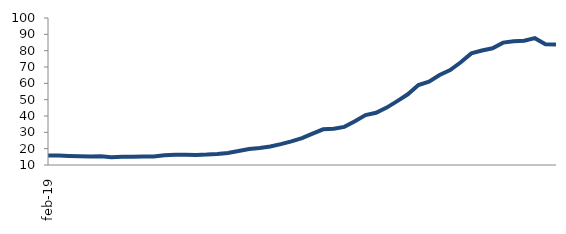
| Category | Series 0 |
|---|---|
| 2019-02-01 | 15.859 |
| 2019-03-01 | 15.762 |
| 2019-04-01 | 15.486 |
| 2019-05-01 | 15.319 |
| 2019-06-01 | 15.27 |
| 2019-07-01 | 15.317 |
| 2019-08-01 | 14.744 |
| 2019-09-01 | 15.056 |
| 2019-10-01 | 15.116 |
| 2019-11-01 | 15.185 |
| 2019-12-01 | 15.165 |
| 2020-01-01 | 15.917 |
| 2020-02-01 | 16.225 |
| 2020-03-01 | 16.228 |
| 2020-04-01 | 16.172 |
| 2020-05-01 | 16.362 |
| 2020-06-01 | 16.723 |
| 2020-07-01 | 17.365 |
| 2020-08-01 | 18.526 |
| 2020-09-01 | 19.846 |
| 2020-10-01 | 20.404 |
| 2020-11-01 | 21.294 |
| 2020-12-01 | 22.781 |
| 2021-01-01 | 24.447 |
| 2021-02-01 | 26.406 |
| 2021-03-01 | 29.172 |
| 2021-04-01 | 31.839 |
| 2021-05-01 | 32.208 |
| 2021-06-01 | 33.334 |
| 2021-07-01 | 36.745 |
| 2021-08-01 | 40.523 |
| 2021-09-01 | 41.963 |
| 2021-10-01 | 45.141 |
| 2021-11-01 | 49.115 |
| 2021-12-01 | 53.284 |
| 2022-01-01 | 58.918 |
| 2022-02-01 | 60.986 |
| 2022-03-01 | 65.12 |
| 2022-04-01 | 68.133 |
| 2022-05-01 | 72.877 |
| 2022-06-01 | 78.33 |
| 2022-07-01 | 80.069 |
| 2022-08-01 | 81.469 |
| 2022-09-01 | 84.915 |
| 2022-10-01 | 85.787 |
| 2022-11-01 | 86.039 |
| 2022-12-01 | 87.664 |
| 2023-01-01 | 83.881 |
| 2023-02-01 | 83.774 |